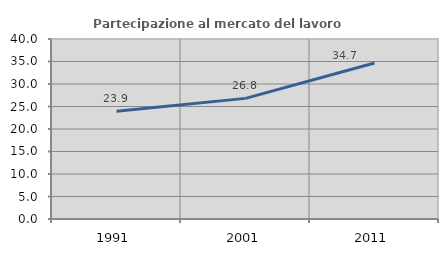
| Category | Partecipazione al mercato del lavoro  femminile |
|---|---|
| 1991.0 | 23.919 |
| 2001.0 | 26.804 |
| 2011.0 | 34.679 |